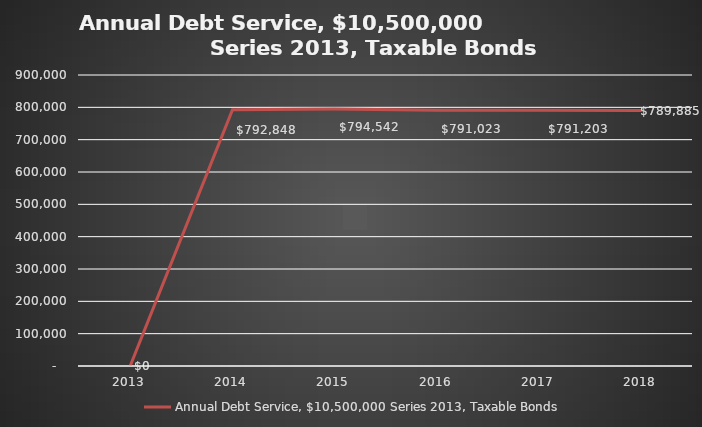
| Category | Annual Debt Service, $10,500,000 Series 2013, Taxable Bonds |
|---|---|
| 2013.0 | 0 |
| 2014.0 | 792848 |
| 2015.0 | 794542 |
| 2016.0 | 791023 |
| 2017.0 | 791203 |
| 2018.0 | 789885 |